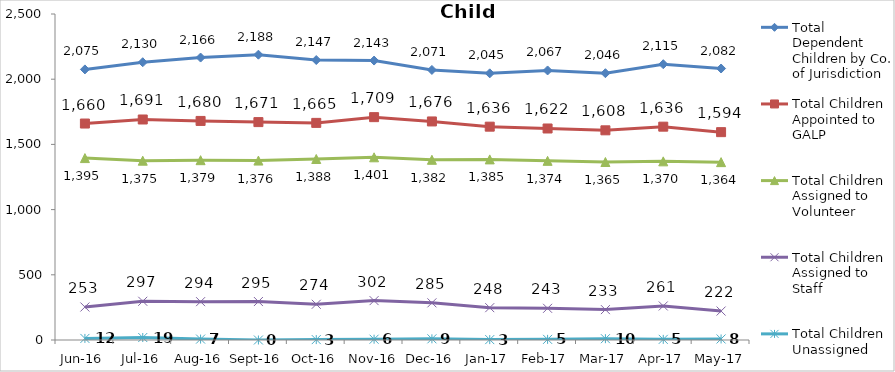
| Category | Total Dependent Children by Co. of Jurisdiction | Total Children Appointed to GALP | Total Children Assigned to Volunteer | Total Children Assigned to Staff | Total Children Unassigned |
|---|---|---|---|---|---|
| Jun-16 | 2075 | 1660 | 1395 | 253 | 12 |
| Jul-16 | 2130 | 1691 | 1375 | 297 | 19 |
| Aug-16 | 2166 | 1680 | 1379 | 294 | 7 |
| Sep-16 | 2188 | 1671 | 1376 | 295 | 0 |
| Oct-16 | 2147 | 1665 | 1388 | 274 | 3 |
| Nov-16 | 2143 | 1709 | 1401 | 302 | 6 |
| Dec-16 | 2071 | 1676 | 1382 | 285 | 9 |
| Jan-17 | 2045 | 1636 | 1385 | 248 | 3 |
| Feb-17 | 2067 | 1622 | 1374 | 243 | 5 |
| Mar-17 | 2046 | 1608 | 1365 | 233 | 10 |
| Apr-17 | 2115 | 1636 | 1370 | 261 | 5 |
| May-17 | 2082 | 1594 | 1364 | 222 | 8 |